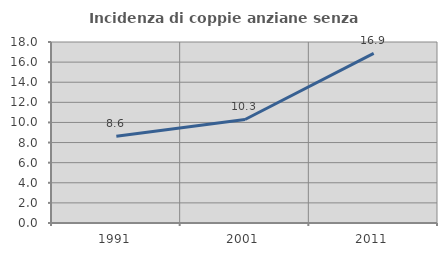
| Category | Incidenza di coppie anziane senza figli  |
|---|---|
| 1991.0 | 8.633 |
| 2001.0 | 10.294 |
| 2011.0 | 16.867 |